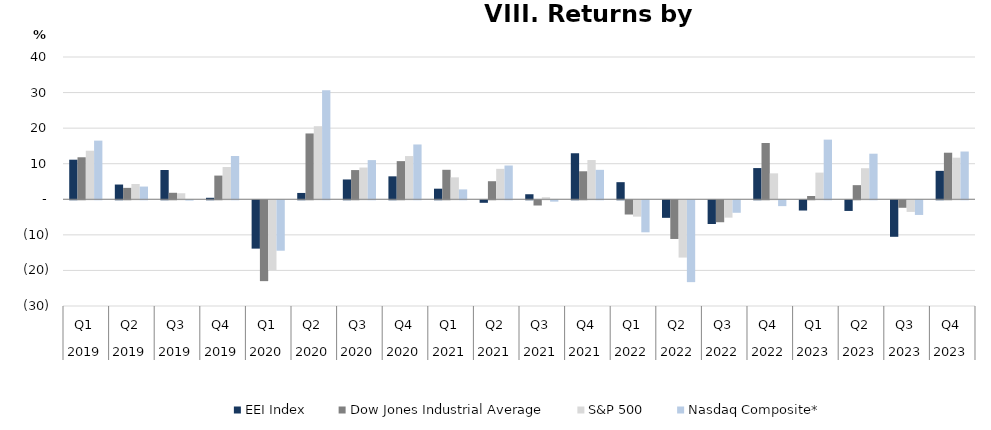
| Category | EEI Index | Dow Jones Industrial Average | S&P 500 | Nasdaq Composite* |
|---|---|---|---|---|
| 0 | 11.13 | 11.81 | 13.65 | 16.49 |
| 1 | 4.148 | 3.211 | 4.303 | 3.58 |
| 2 | 8.225 | 1.828 | 1.696 | -0.083 |
| 3 | 0.423 | 6.663 | 9.075 | 12.168 |
| 4 | -13.59 | -22.73 | -19.6 | -14.18 |
| 5 | 1.782 | 18.507 | 20.547 | 30.634 |
| 6 | 5.571 | 8.212 | 8.925 | 11.016 |
| 7 | 6.451 | 10.728 | 12.153 | 15.411 |
| 8 | 2.98 | 8.29 | 6.17 | 2.78 |
| 9 | -0.709 | 5.079 | 8.552 | 9.496 |
| 10 | 1.418 | -1.468 | 0.581 | -0.382 |
| 11 | 12.941 | 7.875 | 11.033 | 8.278 |
| 12 | 4.81 | -4 | -4.6 | -9 |
| 13 | -4.933 | -10.875 | -16.101 | -23.011 |
| 14 | -6.674 | -6.171 | -4.885 | -3.511 |
| 15 | 8.775 | 15.82 | 7.29 | -1.642 |
| 16 | -2.88 | 0.93 | 7.5 | 16.77 |
| 17 | -2.996 | 3.973 | 8.735 | 12.812 |
| 18 | -10.264 | -2.106 | -3.268 | -4.122 |
| 19 | 7.996 | 13.093 | 11.692 | 13.428 |